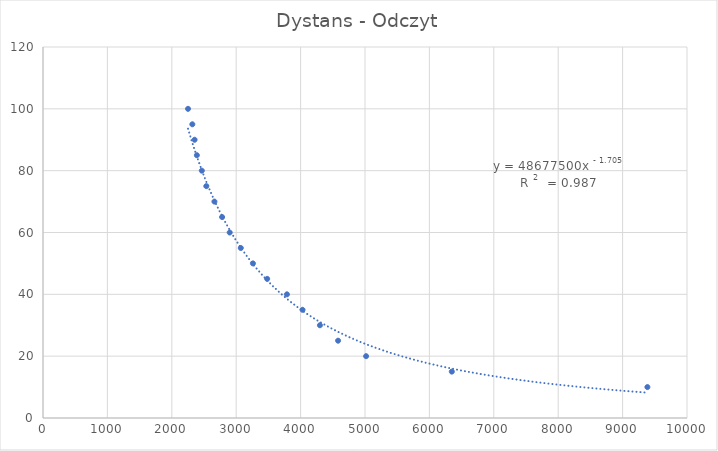
| Category | Dystans (cm) |
|---|---|
| 9385.0 | 10 |
| 6348.0 | 15 |
| 5017.0 | 20 |
| 4582.0 | 25 |
| 4300.0 | 30 |
| 4030.0 | 35 |
| 3788.0 | 40 |
| 3481.0 | 45 |
| 3260.0 | 50 |
| 3071.0 | 55 |
| 2899.0 | 60 |
| 2781.0 | 65 |
| 2662.0 | 70 |
| 2536.0 | 75 |
| 2466.0 | 80 |
| 2389.0 | 85 |
| 2354.0 | 90 |
| 2319.0 | 95 |
| 2252.0 | 100 |